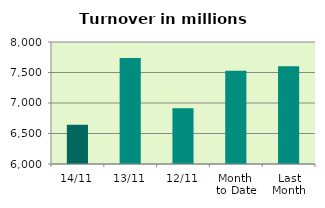
| Category | Series 0 |
|---|---|
| 14/11 | 6643.19 |
| 13/11 | 7736.875 |
| 12/11 | 6912.393 |
| Month 
to Date | 7528.588 |
| Last
Month | 7601.18 |